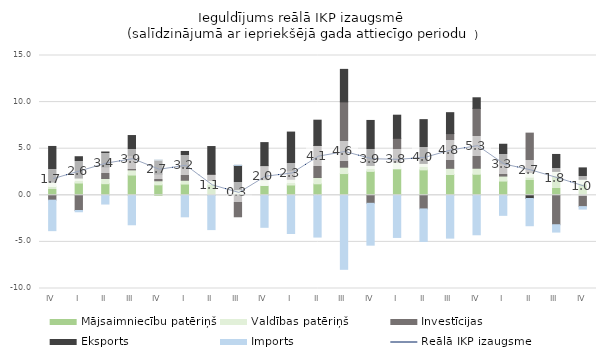
| Category | Mājsaimniecību patēriņš | Valdības patēriņš | Investīcijas | Eksports | Imports |
|---|---|---|---|---|---|
| IV | 0.942 | 0.471 | -0.522 | 3.828 | -3.27 |
| I | 1.316 | 0.534 | -1.63 | 2.289 | -0.137 |
| II | 1.246 | 0.556 | 1.239 | 1.604 | -0.938 |
| III | 2.174 | 0.555 | 1.531 | 2.152 | -3.163 |
| IV | 1.125 | 0.436 | 0.714 | 1.508 | 0.026 |
| I | 1.207 | 0.407 | 1.41 | 1.68 | -2.307 |
| II | 1.183 | 0.401 | 0.699 | 2.95 | -3.68 |
| III | 0.131 | 0.464 | -2.305 | 2.612 | 0.008 |
| IV | 1.059 | 0.617 | 1.461 | 2.518 | -3.434 |
| I | 1.105 | 0.615 | 0.93 | 4.133 | -4.101 |
| II | 1.233 | 0.675 | 3.448 | 2.704 | -4.481 |
| III | 2.331 | 0.685 | 7.009 | 3.486 | -7.942 |
| IV | 2.567 | 0.637 | -0.859 | 4.827 | -4.49 |
| I | 2.83 | 0.711 | 2.573 | 2.482 | -4.522 |
| II | 2.727 | 0.694 | -1.462 | 4.697 | -3.489 |
| III | 2.233 | 0.661 | 3.728 | 2.244 | -4.594 |
| IV | 2.259 | 0.645 | 6.425 | 1.133 | -4.235 |
| I | 1.527 | 0.537 | 1.32 | 2.093 | -2.151 |
| II | 1.941 | 0.497 | 4.234 | -0.346 | -2.919 |
| III | 2.067 | 0.498 | -3.158 | 1.818 | -0.788 |
| IV | 1.231 | 0.485 | -1.211 | 1.225 | -0.272 |